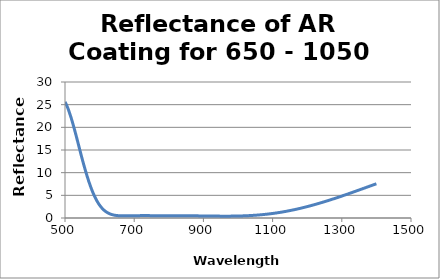
| Category | Reflectance (%) |
|---|---|
| 500.0 | 25.619 |
| 501.0 | 25.476 |
| 502.0 | 25.325 |
| 503.0 | 25.167 |
| 504.0 | 25.001 |
| 505.0 | 24.828 |
| 506.0 | 24.649 |
| 507.0 | 24.462 |
| 508.0 | 24.27 |
| 509.0 | 24.071 |
| 510.0 | 23.866 |
| 511.0 | 23.655 |
| 512.0 | 23.438 |
| 513.0 | 23.216 |
| 514.0 | 22.988 |
| 515.0 | 22.756 |
| 516.0 | 22.518 |
| 517.0 | 22.276 |
| 518.0 | 22.029 |
| 519.0 | 21.778 |
| 520.0 | 21.523 |
| 521.0 | 21.263 |
| 522.0 | 21 |
| 523.0 | 20.734 |
| 524.0 | 20.464 |
| 525.0 | 20.191 |
| 526.0 | 19.915 |
| 527.0 | 19.636 |
| 528.0 | 19.355 |
| 529.0 | 19.072 |
| 530.0 | 18.786 |
| 531.0 | 18.498 |
| 532.0 | 18.209 |
| 533.0 | 17.918 |
| 534.0 | 17.627 |
| 535.0 | 17.334 |
| 536.0 | 17.04 |
| 537.0 | 16.745 |
| 538.0 | 16.45 |
| 539.0 | 16.155 |
| 540.0 | 15.859 |
| 541.0 | 15.563 |
| 542.0 | 15.268 |
| 543.0 | 14.972 |
| 544.0 | 14.678 |
| 545.0 | 14.384 |
| 546.0 | 14.09 |
| 547.0 | 13.798 |
| 548.0 | 13.507 |
| 549.0 | 13.218 |
| 550.0 | 12.93 |
| 551.0 | 12.649 |
| 552.0 | 12.37 |
| 553.0 | 12.093 |
| 554.0 | 11.818 |
| 555.0 | 11.546 |
| 556.0 | 11.275 |
| 557.0 | 11.007 |
| 558.0 | 10.742 |
| 559.0 | 10.479 |
| 560.0 | 10.219 |
| 561.0 | 9.962 |
| 562.0 | 9.708 |
| 563.0 | 9.458 |
| 564.0 | 9.21 |
| 565.0 | 8.966 |
| 566.0 | 8.725 |
| 567.0 | 8.487 |
| 568.0 | 8.253 |
| 569.0 | 8.023 |
| 570.0 | 7.796 |
| 571.0 | 7.574 |
| 572.0 | 7.355 |
| 573.0 | 7.139 |
| 574.0 | 6.928 |
| 575.0 | 6.721 |
| 576.0 | 6.517 |
| 577.0 | 6.318 |
| 578.0 | 6.122 |
| 579.0 | 5.931 |
| 580.0 | 5.744 |
| 581.0 | 5.56 |
| 582.0 | 5.381 |
| 583.0 | 5.206 |
| 584.0 | 5.035 |
| 585.0 | 4.868 |
| 586.0 | 4.705 |
| 587.0 | 4.546 |
| 588.0 | 4.392 |
| 589.0 | 4.241 |
| 590.0 | 4.094 |
| 591.0 | 3.951 |
| 592.0 | 3.812 |
| 593.0 | 3.677 |
| 594.0 | 3.546 |
| 595.0 | 3.418 |
| 596.0 | 3.294 |
| 597.0 | 3.174 |
| 598.0 | 3.058 |
| 599.0 | 2.945 |
| 600.0 | 2.836 |
| 601.0 | 2.73 |
| 602.0 | 2.628 |
| 603.0 | 2.529 |
| 604.0 | 2.433 |
| 605.0 | 2.341 |
| 606.0 | 2.252 |
| 607.0 | 2.166 |
| 608.0 | 2.083 |
| 609.0 | 2.003 |
| 610.0 | 1.926 |
| 611.0 | 1.852 |
| 612.0 | 1.781 |
| 613.0 | 1.713 |
| 614.0 | 1.647 |
| 615.0 | 1.584 |
| 616.0 | 1.523 |
| 617.0 | 1.465 |
| 618.0 | 1.409 |
| 619.0 | 1.356 |
| 620.0 | 1.305 |
| 621.0 | 1.256 |
| 622.0 | 1.209 |
| 623.0 | 1.165 |
| 624.0 | 1.122 |
| 625.0 | 1.082 |
| 626.0 | 1.043 |
| 627.0 | 1.006 |
| 628.0 | 0.971 |
| 629.0 | 0.938 |
| 630.0 | 0.906 |
| 631.0 | 0.876 |
| 632.0 | 0.848 |
| 633.0 | 0.821 |
| 634.0 | 0.795 |
| 635.0 | 0.771 |
| 636.0 | 0.748 |
| 637.0 | 0.727 |
| 638.0 | 0.707 |
| 639.0 | 0.688 |
| 640.0 | 0.67 |
| 641.0 | 0.653 |
| 642.0 | 0.637 |
| 643.0 | 0.622 |
| 644.0 | 0.608 |
| 645.0 | 0.596 |
| 646.0 | 0.584 |
| 647.0 | 0.572 |
| 648.0 | 0.562 |
| 649.0 | 0.552 |
| 650.0 | 0.544 |
| 651.0 | 0.536 |
| 652.0 | 0.528 |
| 653.0 | 0.521 |
| 654.0 | 0.515 |
| 655.0 | 0.509 |
| 656.0 | 0.504 |
| 657.0 | 0.499 |
| 658.0 | 0.495 |
| 659.0 | 0.492 |
| 660.0 | 0.488 |
| 661.0 | 0.485 |
| 662.0 | 0.483 |
| 663.0 | 0.481 |
| 664.0 | 0.479 |
| 665.0 | 0.477 |
| 666.0 | 0.476 |
| 667.0 | 0.475 |
| 668.0 | 0.474 |
| 669.0 | 0.474 |
| 670.0 | 0.474 |
| 671.0 | 0.474 |
| 672.0 | 0.474 |
| 673.0 | 0.474 |
| 674.0 | 0.475 |
| 675.0 | 0.475 |
| 676.0 | 0.476 |
| 677.0 | 0.477 |
| 678.0 | 0.478 |
| 679.0 | 0.479 |
| 680.0 | 0.48 |
| 681.0 | 0.481 |
| 682.0 | 0.482 |
| 683.0 | 0.484 |
| 684.0 | 0.485 |
| 685.0 | 0.487 |
| 686.0 | 0.488 |
| 687.0 | 0.49 |
| 688.0 | 0.491 |
| 689.0 | 0.492 |
| 690.0 | 0.494 |
| 691.0 | 0.496 |
| 692.0 | 0.497 |
| 693.0 | 0.498 |
| 694.0 | 0.5 |
| 695.0 | 0.501 |
| 696.0 | 0.503 |
| 697.0 | 0.504 |
| 698.0 | 0.506 |
| 699.0 | 0.507 |
| 700.0 | 0.508 |
| 701.0 | 0.509 |
| 702.0 | 0.511 |
| 703.0 | 0.512 |
| 704.0 | 0.513 |
| 705.0 | 0.514 |
| 706.0 | 0.515 |
| 707.0 | 0.516 |
| 708.0 | 0.517 |
| 709.0 | 0.518 |
| 710.0 | 0.519 |
| 711.0 | 0.52 |
| 712.0 | 0.521 |
| 713.0 | 0.521 |
| 714.0 | 0.522 |
| 715.0 | 0.523 |
| 716.0 | 0.523 |
| 717.0 | 0.524 |
| 718.0 | 0.524 |
| 719.0 | 0.525 |
| 720.0 | 0.525 |
| 721.0 | 0.526 |
| 722.0 | 0.526 |
| 723.0 | 0.526 |
| 724.0 | 0.526 |
| 725.0 | 0.526 |
| 726.0 | 0.527 |
| 727.0 | 0.527 |
| 728.0 | 0.527 |
| 729.0 | 0.527 |
| 730.0 | 0.527 |
| 731.0 | 0.527 |
| 732.0 | 0.527 |
| 733.0 | 0.527 |
| 734.0 | 0.527 |
| 735.0 | 0.526 |
| 736.0 | 0.526 |
| 737.0 | 0.526 |
| 738.0 | 0.526 |
| 739.0 | 0.526 |
| 740.0 | 0.525 |
| 741.0 | 0.525 |
| 742.0 | 0.525 |
| 743.0 | 0.524 |
| 744.0 | 0.524 |
| 745.0 | 0.524 |
| 746.0 | 0.523 |
| 747.0 | 0.523 |
| 748.0 | 0.523 |
| 749.0 | 0.522 |
| 750.0 | 0.522 |
| 751.0 | 0.521 |
| 752.0 | 0.521 |
| 753.0 | 0.52 |
| 754.0 | 0.52 |
| 755.0 | 0.52 |
| 756.0 | 0.519 |
| 757.0 | 0.519 |
| 758.0 | 0.518 |
| 759.0 | 0.518 |
| 760.0 | 0.517 |
| 761.0 | 0.517 |
| 762.0 | 0.516 |
| 763.0 | 0.516 |
| 764.0 | 0.516 |
| 765.0 | 0.515 |
| 766.0 | 0.515 |
| 767.0 | 0.514 |
| 768.0 | 0.514 |
| 769.0 | 0.513 |
| 770.0 | 0.513 |
| 771.0 | 0.512 |
| 772.0 | 0.512 |
| 773.0 | 0.512 |
| 774.0 | 0.511 |
| 775.0 | 0.511 |
| 776.0 | 0.51 |
| 777.0 | 0.51 |
| 778.0 | 0.51 |
| 779.0 | 0.509 |
| 780.0 | 0.509 |
| 781.0 | 0.509 |
| 782.0 | 0.508 |
| 783.0 | 0.508 |
| 784.0 | 0.507 |
| 785.0 | 0.507 |
| 786.0 | 0.507 |
| 787.0 | 0.507 |
| 788.0 | 0.506 |
| 789.0 | 0.506 |
| 790.0 | 0.506 |
| 791.0 | 0.505 |
| 792.0 | 0.505 |
| 793.0 | 0.505 |
| 794.0 | 0.504 |
| 795.0 | 0.504 |
| 796.0 | 0.504 |
| 797.0 | 0.504 |
| 798.0 | 0.503 |
| 799.0 | 0.503 |
| 800.0 | 0.503 |
| 801.0 | 0.503 |
| 802.0 | 0.503 |
| 803.0 | 0.503 |
| 804.0 | 0.503 |
| 805.0 | 0.503 |
| 806.0 | 0.502 |
| 807.0 | 0.502 |
| 808.0 | 0.502 |
| 809.0 | 0.502 |
| 810.0 | 0.502 |
| 811.0 | 0.502 |
| 812.0 | 0.502 |
| 813.0 | 0.502 |
| 814.0 | 0.502 |
| 815.0 | 0.502 |
| 816.0 | 0.502 |
| 817.0 | 0.502 |
| 818.0 | 0.501 |
| 819.0 | 0.501 |
| 820.0 | 0.501 |
| 821.0 | 0.501 |
| 822.0 | 0.501 |
| 823.0 | 0.501 |
| 824.0 | 0.501 |
| 825.0 | 0.501 |
| 826.0 | 0.501 |
| 827.0 | 0.501 |
| 828.0 | 0.5 |
| 829.0 | 0.5 |
| 830.0 | 0.5 |
| 831.0 | 0.5 |
| 832.0 | 0.5 |
| 833.0 | 0.5 |
| 834.0 | 0.499 |
| 835.0 | 0.499 |
| 836.0 | 0.499 |
| 837.0 | 0.499 |
| 838.0 | 0.498 |
| 839.0 | 0.498 |
| 840.0 | 0.498 |
| 841.0 | 0.498 |
| 842.0 | 0.497 |
| 843.0 | 0.497 |
| 844.0 | 0.497 |
| 845.0 | 0.496 |
| 846.0 | 0.496 |
| 847.0 | 0.496 |
| 848.0 | 0.495 |
| 849.0 | 0.495 |
| 850.0 | 0.494 |
| 851.0 | 0.494 |
| 852.0 | 0.494 |
| 853.0 | 0.493 |
| 854.0 | 0.493 |
| 855.0 | 0.492 |
| 856.0 | 0.492 |
| 857.0 | 0.491 |
| 858.0 | 0.491 |
| 859.0 | 0.49 |
| 860.0 | 0.489 |
| 861.0 | 0.489 |
| 862.0 | 0.488 |
| 863.0 | 0.488 |
| 864.0 | 0.487 |
| 865.0 | 0.486 |
| 866.0 | 0.486 |
| 867.0 | 0.485 |
| 868.0 | 0.484 |
| 869.0 | 0.483 |
| 870.0 | 0.483 |
| 871.0 | 0.482 |
| 872.0 | 0.481 |
| 873.0 | 0.48 |
| 874.0 | 0.479 |
| 875.0 | 0.478 |
| 876.0 | 0.478 |
| 877.0 | 0.477 |
| 878.0 | 0.476 |
| 879.0 | 0.475 |
| 880.0 | 0.474 |
| 881.0 | 0.473 |
| 882.0 | 0.472 |
| 883.0 | 0.471 |
| 884.0 | 0.47 |
| 885.0 | 0.469 |
| 886.0 | 0.468 |
| 887.0 | 0.467 |
| 888.0 | 0.466 |
| 889.0 | 0.465 |
| 890.0 | 0.464 |
| 891.0 | 0.463 |
| 892.0 | 0.462 |
| 893.0 | 0.46 |
| 894.0 | 0.459 |
| 895.0 | 0.458 |
| 896.0 | 0.457 |
| 897.0 | 0.456 |
| 898.0 | 0.455 |
| 899.0 | 0.454 |
| 900.0 | 0.452 |
| 901.0 | 0.451 |
| 902.0 | 0.45 |
| 903.0 | 0.449 |
| 904.0 | 0.448 |
| 905.0 | 0.447 |
| 906.0 | 0.446 |
| 907.0 | 0.446 |
| 908.0 | 0.444 |
| 909.0 | 0.444 |
| 910.0 | 0.443 |
| 911.0 | 0.442 |
| 912.0 | 0.441 |
| 913.0 | 0.44 |
| 914.0 | 0.439 |
| 915.0 | 0.438 |
| 916.0 | 0.437 |
| 917.0 | 0.436 |
| 918.0 | 0.435 |
| 919.0 | 0.434 |
| 920.0 | 0.433 |
| 921.0 | 0.432 |
| 922.0 | 0.432 |
| 923.0 | 0.431 |
| 924.0 | 0.43 |
| 925.0 | 0.429 |
| 926.0 | 0.428 |
| 927.0 | 0.427 |
| 928.0 | 0.426 |
| 929.0 | 0.426 |
| 930.0 | 0.425 |
| 931.0 | 0.424 |
| 932.0 | 0.423 |
| 933.0 | 0.422 |
| 934.0 | 0.422 |
| 935.0 | 0.421 |
| 936.0 | 0.42 |
| 937.0 | 0.42 |
| 938.0 | 0.419 |
| 939.0 | 0.418 |
| 940.0 | 0.418 |
| 941.0 | 0.417 |
| 942.0 | 0.416 |
| 943.0 | 0.416 |
| 944.0 | 0.415 |
| 945.0 | 0.414 |
| 946.0 | 0.414 |
| 947.0 | 0.414 |
| 948.0 | 0.413 |
| 949.0 | 0.412 |
| 950.0 | 0.412 |
| 951.0 | 0.412 |
| 952.0 | 0.411 |
| 953.0 | 0.411 |
| 954.0 | 0.411 |
| 955.0 | 0.41 |
| 956.0 | 0.41 |
| 957.0 | 0.41 |
| 958.0 | 0.41 |
| 959.0 | 0.409 |
| 960.0 | 0.409 |
| 961.0 | 0.409 |
| 962.0 | 0.409 |
| 963.0 | 0.409 |
| 964.0 | 0.409 |
| 965.0 | 0.409 |
| 966.0 | 0.409 |
| 967.0 | 0.409 |
| 968.0 | 0.409 |
| 969.0 | 0.41 |
| 970.0 | 0.41 |
| 971.0 | 0.41 |
| 972.0 | 0.41 |
| 973.0 | 0.41 |
| 974.0 | 0.411 |
| 975.0 | 0.411 |
| 976.0 | 0.412 |
| 977.0 | 0.412 |
| 978.0 | 0.413 |
| 979.0 | 0.413 |
| 980.0 | 0.414 |
| 981.0 | 0.415 |
| 982.0 | 0.415 |
| 983.0 | 0.416 |
| 984.0 | 0.417 |
| 985.0 | 0.418 |
| 986.0 | 0.419 |
| 987.0 | 0.42 |
| 988.0 | 0.421 |
| 989.0 | 0.422 |
| 990.0 | 0.423 |
| 991.0 | 0.424 |
| 992.0 | 0.425 |
| 993.0 | 0.427 |
| 994.0 | 0.428 |
| 995.0 | 0.429 |
| 996.0 | 0.431 |
| 997.0 | 0.432 |
| 998.0 | 0.434 |
| 999.0 | 0.436 |
| 1000.0 | 0.437 |
| 1001.0 | 0.439 |
| 1002.0 | 0.441 |
| 1003.0 | 0.443 |
| 1004.0 | 0.445 |
| 1005.0 | 0.447 |
| 1006.0 | 0.449 |
| 1007.0 | 0.451 |
| 1008.0 | 0.453 |
| 1009.0 | 0.455 |
| 1010.0 | 0.458 |
| 1011.0 | 0.46 |
| 1012.0 | 0.463 |
| 1013.0 | 0.465 |
| 1014.0 | 0.468 |
| 1015.0 | 0.47 |
| 1016.0 | 0.473 |
| 1017.0 | 0.476 |
| 1018.0 | 0.479 |
| 1019.0 | 0.482 |
| 1020.0 | 0.485 |
| 1021.0 | 0.488 |
| 1022.0 | 0.491 |
| 1023.0 | 0.494 |
| 1024.0 | 0.498 |
| 1025.0 | 0.501 |
| 1026.0 | 0.504 |
| 1027.0 | 0.508 |
| 1028.0 | 0.512 |
| 1029.0 | 0.515 |
| 1030.0 | 0.519 |
| 1031.0 | 0.523 |
| 1032.0 | 0.527 |
| 1033.0 | 0.531 |
| 1034.0 | 0.535 |
| 1035.0 | 0.539 |
| 1036.0 | 0.543 |
| 1037.0 | 0.548 |
| 1038.0 | 0.552 |
| 1039.0 | 0.556 |
| 1040.0 | 0.561 |
| 1041.0 | 0.566 |
| 1042.0 | 0.57 |
| 1043.0 | 0.575 |
| 1044.0 | 0.58 |
| 1045.0 | 0.585 |
| 1046.0 | 0.59 |
| 1047.0 | 0.595 |
| 1048.0 | 0.6 |
| 1049.0 | 0.606 |
| 1050.0 | 0.611 |
| 1051.0 | 0.616 |
| 1052.0 | 0.622 |
| 1053.0 | 0.628 |
| 1054.0 | 0.633 |
| 1055.0 | 0.639 |
| 1056.0 | 0.645 |
| 1057.0 | 0.651 |
| 1058.0 | 0.657 |
| 1059.0 | 0.664 |
| 1060.0 | 0.67 |
| 1061.0 | 0.676 |
| 1062.0 | 0.683 |
| 1063.0 | 0.689 |
| 1064.0 | 0.696 |
| 1065.0 | 0.702 |
| 1066.0 | 0.709 |
| 1067.0 | 0.716 |
| 1068.0 | 0.723 |
| 1069.0 | 0.73 |
| 1070.0 | 0.738 |
| 1071.0 | 0.745 |
| 1072.0 | 0.752 |
| 1073.0 | 0.76 |
| 1074.0 | 0.767 |
| 1075.0 | 0.775 |
| 1076.0 | 0.783 |
| 1077.0 | 0.791 |
| 1078.0 | 0.799 |
| 1079.0 | 0.807 |
| 1080.0 | 0.815 |
| 1081.0 | 0.823 |
| 1082.0 | 0.831 |
| 1083.0 | 0.84 |
| 1084.0 | 0.848 |
| 1085.0 | 0.857 |
| 1086.0 | 0.866 |
| 1087.0 | 0.875 |
| 1088.0 | 0.884 |
| 1089.0 | 0.893 |
| 1090.0 | 0.902 |
| 1091.0 | 0.911 |
| 1092.0 | 0.92 |
| 1093.0 | 0.93 |
| 1094.0 | 0.939 |
| 1095.0 | 0.949 |
| 1096.0 | 0.959 |
| 1097.0 | 0.968 |
| 1098.0 | 0.978 |
| 1099.0 | 0.988 |
| 1100.0 | 0.999 |
| 1101.0 | 1.009 |
| 1102.0 | 1.019 |
| 1103.0 | 1.03 |
| 1104.0 | 1.04 |
| 1105.0 | 1.051 |
| 1106.0 | 1.062 |
| 1107.0 | 1.072 |
| 1108.0 | 1.083 |
| 1109.0 | 1.094 |
| 1110.0 | 1.105 |
| 1111.0 | 1.117 |
| 1112.0 | 1.128 |
| 1113.0 | 1.14 |
| 1114.0 | 1.151 |
| 1115.0 | 1.163 |
| 1116.0 | 1.174 |
| 1117.0 | 1.186 |
| 1118.0 | 1.198 |
| 1119.0 | 1.21 |
| 1120.0 | 1.222 |
| 1121.0 | 1.235 |
| 1122.0 | 1.247 |
| 1123.0 | 1.26 |
| 1124.0 | 1.272 |
| 1125.0 | 1.285 |
| 1126.0 | 1.298 |
| 1127.0 | 1.31 |
| 1128.0 | 1.323 |
| 1129.0 | 1.336 |
| 1130.0 | 1.35 |
| 1131.0 | 1.363 |
| 1132.0 | 1.376 |
| 1133.0 | 1.39 |
| 1134.0 | 1.403 |
| 1135.0 | 1.417 |
| 1136.0 | 1.431 |
| 1137.0 | 1.445 |
| 1138.0 | 1.459 |
| 1139.0 | 1.473 |
| 1140.0 | 1.487 |
| 1141.0 | 1.501 |
| 1142.0 | 1.516 |
| 1143.0 | 1.53 |
| 1144.0 | 1.544 |
| 1145.0 | 1.559 |
| 1146.0 | 1.574 |
| 1147.0 | 1.589 |
| 1148.0 | 1.604 |
| 1149.0 | 1.619 |
| 1150.0 | 1.634 |
| 1151.0 | 1.649 |
| 1152.0 | 1.665 |
| 1153.0 | 1.68 |
| 1154.0 | 1.696 |
| 1155.0 | 1.711 |
| 1156.0 | 1.727 |
| 1157.0 | 1.743 |
| 1158.0 | 1.759 |
| 1159.0 | 1.775 |
| 1160.0 | 1.791 |
| 1161.0 | 1.807 |
| 1162.0 | 1.824 |
| 1163.0 | 1.84 |
| 1164.0 | 1.857 |
| 1165.0 | 1.873 |
| 1166.0 | 1.89 |
| 1167.0 | 1.907 |
| 1168.0 | 1.924 |
| 1169.0 | 1.941 |
| 1170.0 | 1.958 |
| 1171.0 | 1.975 |
| 1172.0 | 1.992 |
| 1173.0 | 2.01 |
| 1174.0 | 2.027 |
| 1175.0 | 2.045 |
| 1176.0 | 2.062 |
| 1177.0 | 2.08 |
| 1178.0 | 2.098 |
| 1179.0 | 2.116 |
| 1180.0 | 2.134 |
| 1181.0 | 2.152 |
| 1182.0 | 2.17 |
| 1183.0 | 2.188 |
| 1184.0 | 2.207 |
| 1185.0 | 2.225 |
| 1186.0 | 2.244 |
| 1187.0 | 2.262 |
| 1188.0 | 2.281 |
| 1189.0 | 2.3 |
| 1190.0 | 2.319 |
| 1191.0 | 2.338 |
| 1192.0 | 2.357 |
| 1193.0 | 2.376 |
| 1194.0 | 2.395 |
| 1195.0 | 2.415 |
| 1196.0 | 2.434 |
| 1197.0 | 2.454 |
| 1198.0 | 2.473 |
| 1199.0 | 2.493 |
| 1200.0 | 2.513 |
| 1201.0 | 2.532 |
| 1202.0 | 2.552 |
| 1203.0 | 2.572 |
| 1204.0 | 2.593 |
| 1205.0 | 2.613 |
| 1206.0 | 2.633 |
| 1207.0 | 2.653 |
| 1208.0 | 2.674 |
| 1209.0 | 2.694 |
| 1210.0 | 2.715 |
| 1211.0 | 2.736 |
| 1212.0 | 2.756 |
| 1213.0 | 2.777 |
| 1214.0 | 2.798 |
| 1215.0 | 2.819 |
| 1216.0 | 2.84 |
| 1217.0 | 2.861 |
| 1218.0 | 2.882 |
| 1219.0 | 2.904 |
| 1220.0 | 2.925 |
| 1221.0 | 2.946 |
| 1222.0 | 2.968 |
| 1223.0 | 2.989 |
| 1224.0 | 3.011 |
| 1225.0 | 3.033 |
| 1226.0 | 3.055 |
| 1227.0 | 3.076 |
| 1228.0 | 3.098 |
| 1229.0 | 3.12 |
| 1230.0 | 3.142 |
| 1231.0 | 3.165 |
| 1232.0 | 3.187 |
| 1233.0 | 3.209 |
| 1234.0 | 3.232 |
| 1235.0 | 3.254 |
| 1236.0 | 3.276 |
| 1237.0 | 3.299 |
| 1238.0 | 3.322 |
| 1239.0 | 3.344 |
| 1240.0 | 3.367 |
| 1241.0 | 3.39 |
| 1242.0 | 3.413 |
| 1243.0 | 3.436 |
| 1244.0 | 3.459 |
| 1245.0 | 3.482 |
| 1246.0 | 3.505 |
| 1247.0 | 3.528 |
| 1248.0 | 3.552 |
| 1249.0 | 3.575 |
| 1250.0 | 3.598 |
| 1251.0 | 3.622 |
| 1252.0 | 3.645 |
| 1253.0 | 3.669 |
| 1254.0 | 3.692 |
| 1255.0 | 3.716 |
| 1256.0 | 3.74 |
| 1257.0 | 3.764 |
| 1258.0 | 3.788 |
| 1259.0 | 3.812 |
| 1260.0 | 3.836 |
| 1261.0 | 3.86 |
| 1262.0 | 3.884 |
| 1263.0 | 3.908 |
| 1264.0 | 3.932 |
| 1265.0 | 3.956 |
| 1266.0 | 3.981 |
| 1267.0 | 4.005 |
| 1268.0 | 4.029 |
| 1269.0 | 4.054 |
| 1270.0 | 4.078 |
| 1271.0 | 4.103 |
| 1272.0 | 4.128 |
| 1273.0 | 4.152 |
| 1274.0 | 4.177 |
| 1275.0 | 4.202 |
| 1276.0 | 4.227 |
| 1277.0 | 4.252 |
| 1278.0 | 4.277 |
| 1279.0 | 4.302 |
| 1280.0 | 4.327 |
| 1281.0 | 4.352 |
| 1282.0 | 4.377 |
| 1283.0 | 4.402 |
| 1284.0 | 4.427 |
| 1285.0 | 4.452 |
| 1286.0 | 4.478 |
| 1287.0 | 4.503 |
| 1288.0 | 4.528 |
| 1289.0 | 4.554 |
| 1290.0 | 4.579 |
| 1291.0 | 4.605 |
| 1292.0 | 4.63 |
| 1293.0 | 4.656 |
| 1294.0 | 4.682 |
| 1295.0 | 4.707 |
| 1296.0 | 4.733 |
| 1297.0 | 4.759 |
| 1298.0 | 4.784 |
| 1299.0 | 4.81 |
| 1300.0 | 4.836 |
| 1301.0 | 4.862 |
| 1302.0 | 4.889 |
| 1303.0 | 4.915 |
| 1304.0 | 4.941 |
| 1305.0 | 4.968 |
| 1306.0 | 4.994 |
| 1307.0 | 5.02 |
| 1308.0 | 5.047 |
| 1309.0 | 5.073 |
| 1310.0 | 5.1 |
| 1311.0 | 5.126 |
| 1312.0 | 5.153 |
| 1313.0 | 5.18 |
| 1314.0 | 5.206 |
| 1315.0 | 5.233 |
| 1316.0 | 5.259 |
| 1317.0 | 5.286 |
| 1318.0 | 5.313 |
| 1319.0 | 5.34 |
| 1320.0 | 5.366 |
| 1321.0 | 5.393 |
| 1322.0 | 5.42 |
| 1323.0 | 5.447 |
| 1324.0 | 5.474 |
| 1325.0 | 5.501 |
| 1326.0 | 5.528 |
| 1327.0 | 5.554 |
| 1328.0 | 5.582 |
| 1329.0 | 5.608 |
| 1330.0 | 5.636 |
| 1331.0 | 5.662 |
| 1332.0 | 5.69 |
| 1333.0 | 5.717 |
| 1334.0 | 5.744 |
| 1335.0 | 5.771 |
| 1336.0 | 5.798 |
| 1337.0 | 5.825 |
| 1338.0 | 5.852 |
| 1339.0 | 5.88 |
| 1340.0 | 5.907 |
| 1341.0 | 5.934 |
| 1342.0 | 5.961 |
| 1343.0 | 5.988 |
| 1344.0 | 6.016 |
| 1345.0 | 6.043 |
| 1346.0 | 6.07 |
| 1347.0 | 6.098 |
| 1348.0 | 6.125 |
| 1349.0 | 6.152 |
| 1350.0 | 6.179 |
| 1351.0 | 6.207 |
| 1352.0 | 6.234 |
| 1353.0 | 6.262 |
| 1354.0 | 6.289 |
| 1355.0 | 6.316 |
| 1356.0 | 6.344 |
| 1357.0 | 6.371 |
| 1358.0 | 6.398 |
| 1359.0 | 6.426 |
| 1360.0 | 6.453 |
| 1361.0 | 6.481 |
| 1362.0 | 6.508 |
| 1363.0 | 6.536 |
| 1364.0 | 6.563 |
| 1365.0 | 6.591 |
| 1366.0 | 6.618 |
| 1367.0 | 6.646 |
| 1368.0 | 6.673 |
| 1369.0 | 6.7 |
| 1370.0 | 6.728 |
| 1371.0 | 6.756 |
| 1372.0 | 6.783 |
| 1373.0 | 6.81 |
| 1374.0 | 6.838 |
| 1375.0 | 6.866 |
| 1376.0 | 6.893 |
| 1377.0 | 6.92 |
| 1378.0 | 6.948 |
| 1379.0 | 6.976 |
| 1380.0 | 7.003 |
| 1381.0 | 7.03 |
| 1382.0 | 7.058 |
| 1383.0 | 7.085 |
| 1384.0 | 7.113 |
| 1385.0 | 7.14 |
| 1386.0 | 7.168 |
| 1387.0 | 7.195 |
| 1388.0 | 7.223 |
| 1389.0 | 7.25 |
| 1390.0 | 7.278 |
| 1391.0 | 7.305 |
| 1392.0 | 7.333 |
| 1393.0 | 7.36 |
| 1394.0 | 7.388 |
| 1395.0 | 7.415 |
| 1396.0 | 7.443 |
| 1397.0 | 7.47 |
| 1398.0 | 7.498 |
| 1399.0 | 7.525 |
| 1400.0 | 7.552 |